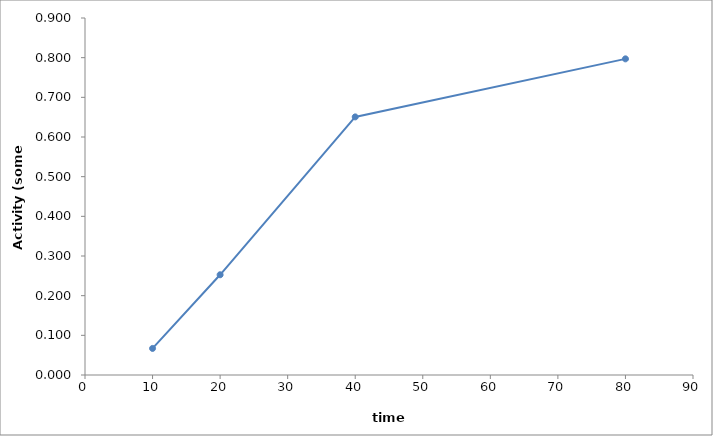
| Category | Series 0 |
|---|---|
| 10.0 | 0.067 |
| 20.0 | 0.253 |
| 40.0 | 0.651 |
| 80.0 | 0.797 |